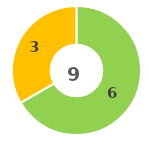
| Category | Series 0 |
|---|---|
| 0 | 0 |
| 1 | 6 |
| 2 | 3 |
| 3 | 0 |
| 4 | 0 |